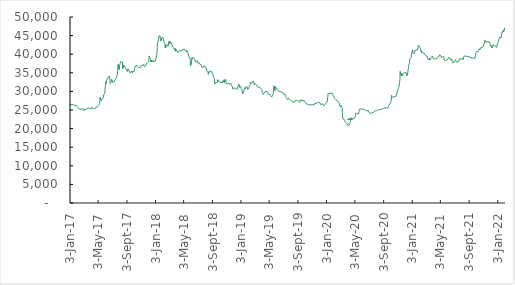
| Category | Series 0 |
|---|---|
| 2017-01-03 | 26616.89 |
| 2017-01-04 | 26495.04 |
| 2017-01-05 | 26212.09 |
| 2017-01-06 | 26251.39 |
| 2017-01-09 | 26580.22 |
| 2017-01-10 | 26346.24 |
| 2017-01-11 | 26385.8 |
| 2017-01-12 | 26330.39 |
| 2017-01-13 | 26325.93 |
| 2017-01-16 | 26373.83 |
| 2017-01-17 | 26278.2 |
| 2017-01-18 | 26245.34 |
| 2017-01-19 | 26201.6 |
| 2017-01-20 | 26223.54 |
| 2017-01-23 | 26231.37 |
| 2017-01-24 | 26217.54 |
| 2017-01-25 | 26240.45 |
| 2017-01-26 | 26289.95 |
| 2017-01-27 | 26328.22 |
| 2017-01-30 | 26217.18 |
| 2017-01-31 | 26036.24 |
| 2017-02-01 | 25900.67 |
| 2017-02-02 | 25936.24 |
| 2017-02-03 | 25802.54 |
| 2017-02-06 | 25587.09 |
| 2017-02-07 | 25446.66 |
| 2017-02-08 | 25460.45 |
| 2017-02-09 | 25322.3 |
| 2017-02-10 | 25340.02 |
| 2017-02-13 | 25244.65 |
| 2017-02-14 | 25032.17 |
| 2017-02-15 | 25130.26 |
| 2017-02-16 | 25055.29 |
| 2017-02-17 | 25164.91 |
| 2017-02-20 | 25249.49 |
| 2017-02-21 | 25251.63 |
| 2017-02-22 | 25249.74 |
| 2017-02-23 | 25409.06 |
| 2017-02-24 | 25250.37 |
| 2017-02-27 | 25373.42 |
| 2017-02-28 | 25329.08 |
| 2017-03-01 | 25183.1 |
| 2017-03-02 | 24829.59 |
| 2017-03-03 | 25012.08 |
| 2017-03-06 | 24581.99 |
| 2017-03-07 | 25129.99 |
| 2017-03-08 | 24994.81 |
| 2017-03-09 | 25170.36 |
| 2017-03-10 | 25238.01 |
| 2017-03-13 | 25136.63 |
| 2017-03-14 | 25284.56 |
| 2017-03-15 | 25301.23 |
| 2017-03-16 | 25418.08 |
| 2017-03-17 | 25653.16 |
| 2017-03-20 | 25671.55 |
| 2017-03-21 | 25558.57 |
| 2017-03-22 | 25514.17 |
| 2017-03-23 | 25514.03 |
| 2017-03-24 | 25454.93 |
| 2017-03-27 | 25485.17 |
| 2017-03-28 | 25406.72 |
| 2017-03-29 | 25267.68 |
| 2017-03-30 | 25533.82 |
| 2017-03-31 | 25516.34 |
| 2017-04-03 | 25273.03 |
| 2017-04-04 | 25266.15 |
| 2017-04-05 | 25471.69 |
| 2017-04-06 | 25755.18 |
| 2017-04-07 | 25746.52 |
| 2017-04-10 | 25626.37 |
| 2017-04-11 | 25478.06 |
| 2017-04-12 | 25496.71 |
| 2017-04-13 | 25510.01 |
| 2017-04-18 | 25218.12 |
| 2017-04-19 | 25331.77 |
| 2017-04-20 | 25288.11 |
| 2017-04-21 | 25189.37 |
| 2017-04-24 | 25747.05 |
| 2017-04-25 | 25818.87 |
| 2017-04-26 | 25620.94 |
| 2017-04-27 | 25753 |
| 2017-04-28 | 25767.26 |
| 2017-05-02 | 25965.18 |
| 2017-05-03 | 26117.32 |
| 2017-05-04 | 26166.8 |
| 2017-05-05 | 26235.63 |
| 2017-05-08 | 26419.17 |
| 2017-05-09 | 26756.21 |
| 2017-05-10 | 27546.68 |
| 2017-05-11 | 28423.7 |
| 2017-05-12 | 28192.46 |
| 2017-05-15 | 27513.69 |
| 2017-05-16 | 27609.67 |
| 2017-05-17 | 27900.44 |
| 2017-05-18 | 28101.63 |
| 2017-05-19 | 28113.44 |
| 2017-05-22 | 28078.3 |
| 2017-05-23 | 28109.95 |
| 2017-05-24 | 28286.43 |
| 2017-05-25 | 28467.61 |
| 2017-05-26 | 29064.52 |
| 2017-05-30 | 29276.59 |
| 2017-05-31 | 29498.31 |
| 2017-06-01 | 30314.14 |
| 2017-06-02 | 31371.63 |
| 2017-06-05 | 32578.38 |
| 2017-06-06 | 32200.38 |
| 2017-06-07 | 32686.72 |
| 2017-06-08 | 32937.98 |
| 2017-06-09 | 33276.68 |
| 2017-06-12 | 33235.28 |
| 2017-06-13 | 33142.18 |
| 2017-06-14 | 33598.2 |
| 2017-06-15 | 33797.84 |
| 2017-06-16 | 33810.56 |
| 2017-06-19 | 34135.1 |
| 2017-06-20 | 34375.6 |
| 2017-06-21 | 33477.89 |
| 2017-06-22 | 32928.44 |
| 2017-06-23 | 32122.14 |
| 2017-06-28 | 32657.3 |
| 2017-06-29 | 33269.84 |
| 2017-06-30 | 33117.48 |
| 2017-07-03 | 32769.8 |
| 2017-07-04 | 32410.2 |
| 2017-07-05 | 32302.32 |
| 2017-07-06 | 32354.78 |
| 2017-07-07 | 32459.17 |
| 2017-07-10 | 32614.6 |
| 2017-07-11 | 32827.98 |
| 2017-07-12 | 32981.63 |
| 2017-07-13 | 33246.91 |
| 2017-07-14 | 33261.66 |
| 2017-07-17 | 33301.43 |
| 2017-07-18 | 33436.61 |
| 2017-07-19 | 33514.93 |
| 2017-07-20 | 33695.83 |
| 2017-07-21 | 34020.37 |
| 2017-07-24 | 34652.52 |
| 2017-07-25 | 35533 |
| 2017-07-26 | 36740.77 |
| 2017-07-27 | 37245.17 |
| 2017-07-28 | 36864.71 |
| 2017-07-31 | 35847.75 |
| 2017-08-01 | 36720.62 |
| 2017-08-02 | 36905.06 |
| 2017-08-03 | 37135.23 |
| 2017-08-04 | 37425.15 |
| 2017-08-07 | 37525.38 |
| 2017-08-08 | 37999.56 |
| 2017-08-09 | 38144.02 |
| 2017-08-10 | 38102.85 |
| 2017-08-11 | 38198.6 |
| 2017-08-14 | 37950.96 |
| 2017-08-15 | 37096.6 |
| 2017-08-16 | 36102.38 |
| 2017-08-17 | 36316.58 |
| 2017-08-18 | 36920.56 |
| 2017-08-21 | 36584.44 |
| 2017-08-22 | 36962.48 |
| 2017-08-23 | 37059.21 |
| 2017-08-24 | 36575.86 |
| 2017-08-25 | 36646.46 |
| 2017-08-28 | 36317.31 |
| 2017-08-29 | 36165.93 |
| 2017-08-30 | 35629.13 |
| 2017-08-31 | 35504.62 |
| 2017-09-05 | 35407.79 |
| 2017-09-06 | 35605.3 |
| 2017-09-07 | 36112.37 |
| 2017-09-08 | 35957.24 |
| 2017-09-11 | 35664.94 |
| 2017-09-12 | 35397.52 |
| 2017-09-13 | 35464.34 |
| 2017-09-14 | 35660.04 |
| 2017-09-15 | 35005.57 |
| 2017-09-18 | 34873.07 |
| 2017-09-19 | 34846.82 |
| 2017-09-20 | 35207.89 |
| 2017-09-21 | 35188.97 |
| 2017-09-22 | 35488.81 |
| 2017-09-25 | 35358.73 |
| 2017-09-26 | 34951.27 |
| 2017-09-27 | 35103.4 |
| 2017-09-28 | 35429.31 |
| 2017-09-29 | 35439.98 |
| 2017-10-03 | 35306.09 |
| 2017-10-04 | 35358.57 |
| 2017-10-05 | 35773.98 |
| 2017-10-06 | 36320.98 |
| 2017-10-09 | 36831.93 |
| 2017-10-10 | 36776.6 |
| 2017-10-11 | 36652.82 |
| 2017-10-12 | 36732.24 |
| 2017-10-13 | 36848.17 |
| 2017-10-16 | 36970.81 |
| 2017-10-17 | 36669.61 |
| 2017-10-18 | 36641.52 |
| 2017-10-19 | 36645.65 |
| 2017-10-20 | 36587.31 |
| 2017-10-23 | 36411.73 |
| 2017-10-24 | 36531.62 |
| 2017-10-25 | 36622.85 |
| 2017-10-26 | 36517.48 |
| 2017-10-27 | 36462.26 |
| 2017-10-30 | 36484.3 |
| 2017-10-31 | 36680.29 |
| 2017-11-01 | 36887.2 |
| 2017-11-02 | 36877.15 |
| 2017-11-03 | 36939.59 |
| 2017-11-06 | 36930.83 |
| 2017-11-07 | 37013.57 |
| 2017-11-08 | 37138.97 |
| 2017-11-09 | 37051.54 |
| 2017-11-10 | 37120.28 |
| 2017-11-13 | 37312.28 |
| 2017-11-14 | 36953.41 |
| 2017-11-15 | 36617.45 |
| 2017-11-16 | 36634.89 |
| 2017-11-17 | 36703.58 |
| 2017-11-20 | 36792.6 |
| 2017-11-21 | 36600.07 |
| 2017-11-22 | 36608.76 |
| 2017-11-23 | 36688.75 |
| 2017-11-24 | 37365.91 |
| 2017-11-27 | 37250.78 |
| 2017-11-28 | 37503.73 |
| 2017-11-29 | 37709.2 |
| 2017-11-30 | 37944.6 |
| 2017-12-04 | 37974.58 |
| 2017-12-05 | 38494.43 |
| 2017-12-06 | 39075.3 |
| 2017-12-07 | 39534.14 |
| 2017-12-08 | 39257.53 |
| 2017-12-11 | 38913.99 |
| 2017-12-12 | 38924.63 |
| 2017-12-13 | 38534.64 |
| 2017-12-14 | 37933.7 |
| 2017-12-15 | 38436.08 |
| 2017-12-18 | 37957.96 |
| 2017-12-19 | 37783.76 |
| 2017-12-20 | 37933.86 |
| 2017-12-21 | 38350.64 |
| 2017-12-22 | 38522.14 |
| 2017-12-27 | 37889.57 |
| 2017-12-28 | 37990.74 |
| 2017-12-29 | 38243.19 |
| 2018-01-02 | 38264.79 |
| 2018-01-03 | 38187.28 |
| 2018-01-04 | 38676.12 |
| 2018-01-05 | 38923.26 |
| 2018-01-08 | 39849.65 |
| 2018-01-09 | 40362.97 |
| 2018-01-10 | 41816.11 |
| 2018-01-11 | 43041.54 |
| 2018-01-12 | 42898.9 |
| 2018-01-15 | 43119 |
| 2018-01-16 | 44054.72 |
| 2018-01-17 | 44885.24 |
| 2018-01-18 | 44848.74 |
| 2018-01-19 | 45092.83 |
| 2018-01-22 | 44912.53 |
| 2018-01-23 | 44389.85 |
| 2018-01-24 | 43963.4 |
| 2018-01-25 | 43529.06 |
| 2018-01-26 | 43773.76 |
| 2018-01-29 | 44306.48 |
| 2018-01-30 | 44493.79 |
| 2018-01-31 | 44343.65 |
| 2018-02-01 | 44460.18 |
| 2018-02-02 | 44639.99 |
| 2018-02-05 | 44261.72 |
| 2018-02-06 | 43877.3 |
| 2018-02-07 | 43538.16 |
| 2018-02-08 | 43326.89 |
| 2018-02-09 | 43127.92 |
| 2018-02-12 | 42737.89 |
| 2018-02-13 | 41708.15 |
| 2018-02-14 | 42171.8 |
| 2018-02-15 | 42604.4 |
| 2018-02-16 | 42638.83 |
| 2018-02-19 | 41988.18 |
| 2018-02-20 | 42148.4 |
| 2018-02-21 | 42158.32 |
| 2018-02-22 | 42258.78 |
| 2018-02-23 | 42570.89 |
| 2018-02-26 | 42579.48 |
| 2018-02-27 | 42299.56 |
| 2018-02-28 | 43330.54 |
| 2018-03-01 | 42843.38 |
| 2018-03-02 | 42876.23 |
| 2018-03-05 | 43513.93 |
| 2018-03-06 | 43609.77 |
| 2018-03-07 | 42952.7 |
| 2018-03-08 | 43092.63 |
| 2018-03-09 | 43167.86 |
| 2018-03-12 | 43056.51 |
| 2018-03-13 | 43073.45 |
| 2018-03-14 | 42839.49 |
| 2018-03-15 | 42185.38 |
| 2018-03-16 | 41935.9 |
| 2018-03-19 | 41845.92 |
| 2018-03-20 | 41686.36 |
| 2018-03-21 | 41495.43 |
| 2018-03-22 | 41633.79 |
| 2018-03-23 | 41472.1 |
| 2018-03-26 | 41454.3 |
| 2018-03-27 | 41243.24 |
| 2018-03-28 | 40802.08 |
| 2018-03-29 | 41504.51 |
| 2018-04-03 | 40855.64 |
| 2018-04-04 | 40749.86 |
| 2018-04-05 | 40875.69 |
| 2018-04-06 | 40841.14 |
| 2018-04-09 | 40429.18 |
| 2018-04-10 | 40499.04 |
| 2018-04-11 | 40846.24 |
| 2018-04-12 | 40813.69 |
| 2018-04-13 | 40928.7 |
| 2018-04-16 | 40987.77 |
| 2018-04-17 | 40788.68 |
| 2018-04-18 | 40772.25 |
| 2018-04-19 | 40874.09 |
| 2018-04-20 | 40814.89 |
| 2018-04-23 | 40763.93 |
| 2018-04-24 | 40802.78 |
| 2018-04-25 | 40755.73 |
| 2018-04-26 | 40777.67 |
| 2018-04-27 | 41244.89 |
| 2018-04-30 | 41268.01 |
| 2018-05-02 | 41306.02 |
| 2018-05-03 | 41107.81 |
| 2018-05-04 | 41218.72 |
| 2018-05-07 | 41233.42 |
| 2018-05-08 | 41155.8 |
| 2018-05-09 | 41080.12 |
| 2018-05-10 | 40915.17 |
| 2018-05-11 | 41022.31 |
| 2018-05-14 | 40677.61 |
| 2018-05-15 | 40628.49 |
| 2018-05-16 | 40992.97 |
| 2018-05-17 | 40676.26 |
| 2018-05-18 | 40472.45 |
| 2018-05-21 | 40425.07 |
| 2018-05-22 | 40249.29 |
| 2018-05-23 | 40150.55 |
| 2018-05-24 | 39723.85 |
| 2018-05-25 | 39323.62 |
| 2018-05-28 | 39040.44 |
| 2018-05-30 | 38606.41 |
| 2018-05-31 | 38104.54 |
| 2018-06-01 | 36816.29 |
| 2018-06-04 | 36947.1 |
| 2018-06-05 | 37854.92 |
| 2018-06-06 | 38435.29 |
| 2018-06-07 | 39042.11 |
| 2018-06-08 | 38669.23 |
| 2018-06-11 | 38845.31 |
| 2018-06-12 | 39167.04 |
| 2018-06-13 | 39031.72 |
| 2018-06-14 | 38928.47 |
| 2018-06-19 | 38664.15 |
| 2018-06-20 | 38605.07 |
| 2018-06-21 | 38152.6 |
| 2018-06-22 | 37862.53 |
| 2018-06-25 | 37992.12 |
| 2018-06-26 | 37988.54 |
| 2018-06-27 | 37963.93 |
| 2018-06-28 | 37733.44 |
| 2018-06-29 | 38278.55 |
| 2018-07-02 | 37946.92 |
| 2018-07-03 | 37606.23 |
| 2018-07-04 | 37499.07 |
| 2018-07-05 | 37743.22 |
| 2018-07-06 | 37625.59 |
| 2018-07-09 | 37647.93 |
| 2018-07-10 | 37422.84 |
| 2018-07-11 | 37253.25 |
| 2018-07-12 | 37226.44 |
| 2018-07-13 | 37392.77 |
| 2018-07-16 | 37266.86 |
| 2018-07-17 | 36963.7 |
| 2018-07-18 | 36748.18 |
| 2018-07-19 | 36506.42 |
| 2018-07-20 | 36603.44 |
| 2018-07-23 | 36711.96 |
| 2018-07-24 | 36455.24 |
| 2018-07-25 | 36346.8 |
| 2018-07-26 | 36427.22 |
| 2018-07-27 | 36636.97 |
| 2018-07-30 | 36946.18 |
| 2018-07-31 | 37017.78 |
| 2018-08-01 | 36612.83 |
| 2018-08-02 | 36688.91 |
| 2018-08-03 | 36499.67 |
| 2018-08-06 | 36479.42 |
| 2018-08-07 | 36333.8 |
| 2018-08-08 | 36299.82 |
| 2018-08-09 | 36232.66 |
| 2018-08-10 | 35446.47 |
| 2018-08-13 | 35399.28 |
| 2018-08-14 | 35288.23 |
| 2018-08-15 | 35074.82 |
| 2018-08-16 | 34617.12 |
| 2018-08-17 | 35266.29 |
| 2018-08-20 | 35341.9 |
| 2018-08-23 | 35206.16 |
| 2018-08-24 | 35426.21 |
| 2018-08-27 | 35311.36 |
| 2018-08-28 | 35516.21 |
| 2018-08-29 | 35358.94 |
| 2018-08-30 | 35086.67 |
| 2018-08-31 | 34848.45 |
| 2018-09-03 | 34837.5 |
| 2018-09-04 | 34933.68 |
| 2018-09-05 | 34414.37 |
| 2018-09-06 | 34110.22 |
| 2018-09-07 | 34037.91 |
| 2018-09-10 | 33611.69 |
| 2018-09-11 | 33449.17 |
| 2018-09-12 | 32292.79 |
| 2018-09-13 | 32022.23 |
| 2018-09-14 | 32327.59 |
| 2018-09-17 | 32201.98 |
| 2018-09-18 | 32381 |
| 2018-09-19 | 32375.12 |
| 2018-09-20 | 32480.89 |
| 2018-09-21 | 32540.17 |
| 2018-09-24 | 32451.27 |
| 2018-09-25 | 33144.44 |
| 2018-09-26 | 32963.27 |
| 2018-09-27 | 32763.35 |
| 2018-09-28 | 32766.37 |
| 2018-10-02 | 32711.65 |
| 2018-10-03 | 32453.03 |
| 2018-10-04 | 32423.57 |
| 2018-10-05 | 32383.15 |
| 2018-10-08 | 32444.96 |
| 2018-10-09 | 32417.7 |
| 2018-10-10 | 32382.58 |
| 2018-10-11 | 32417.82 |
| 2018-10-12 | 32456.98 |
| 2018-10-15 | 32413.48 |
| 2018-10-16 | 32722.18 |
| 2018-10-17 | 32437.35 |
| 2018-10-18 | 32664.63 |
| 2018-10-19 | 32841.69 |
| 2018-10-22 | 32962.82 |
| 2018-10-23 | 33191.45 |
| 2018-10-24 | 32403.6 |
| 2018-10-25 | 32545.06 |
| 2018-10-26 | 32907.33 |
| 2018-10-29 | 33196.07 |
| 2018-10-30 | 33167.88 |
| 2018-10-31 | 32466.27 |
| 2018-11-01 | 32006.65 |
| 2018-11-02 | 32124.94 |
| 2018-11-05 | 32048.18 |
| 2018-11-06 | 32154.03 |
| 2018-11-07 | 32108.3 |
| 2018-11-08 | 32228.5 |
| 2018-11-09 | 32200.21 |
| 2018-11-12 | 32143.41 |
| 2018-11-13 | 32152.9 |
| 2018-11-14 | 32108.92 |
| 2018-11-15 | 31864.8 |
| 2018-11-16 | 32058.28 |
| 2018-11-19 | 32222.24 |
| 2018-11-21 | 31969.79 |
| 2018-11-22 | 31984.6 |
| 2018-11-23 | 31678.7 |
| 2018-11-26 | 31533.51 |
| 2018-11-27 | 31173.71 |
| 2018-11-28 | 31023.47 |
| 2018-11-29 | 30611.55 |
| 2018-11-30 | 30874.17 |
| 2018-12-03 | 30798.76 |
| 2018-12-04 | 31007.25 |
| 2018-12-05 | 31151.68 |
| 2018-12-06 | 30819.1 |
| 2018-12-07 | 30866.82 |
| 2018-12-10 | 30614.73 |
| 2018-12-11 | 30718.72 |
| 2018-12-12 | 30642.35 |
| 2018-12-13 | 30568.05 |
| 2018-12-14 | 30672.79 |
| 2018-12-17 | 30609.02 |
| 2018-12-18 | 30822.33 |
| 2018-12-19 | 30704.98 |
| 2018-12-20 | 30802.9 |
| 2018-12-21 | 30773.64 |
| 2018-12-24 | 31967.01 |
| 2018-12-27 | 31692.63 |
| 2018-12-28 | 31037.72 |
| 2018-12-31 | 31430.5 |
| 2019-01-02 | 31070.06 |
| 2019-01-03 | 30771.32 |
| 2019-01-04 | 30638.9 |
| 2019-01-07 | 30400.28 |
| 2019-01-08 | 30036.15 |
| 2019-01-09 | 29336.8 |
| 2019-01-10 | 29517.73 |
| 2019-01-11 | 29830.7 |
| 2019-01-14 | 29964.79 |
| 2019-01-15 | 30137.53 |
| 2019-01-16 | 30460.68 |
| 2019-01-17 | 30583.21 |
| 2019-01-18 | 31005.17 |
| 2019-01-21 | 30732.72 |
| 2019-01-22 | 30736.88 |
| 2019-01-23 | 30878.56 |
| 2019-01-24 | 30989.6 |
| 2019-01-25 | 31426.63 |
| 2019-01-28 | 31344.24 |
| 2019-01-29 | 31178.71 |
| 2019-01-30 | 31145.34 |
| 2019-01-31 | 30557.2 |
| 2019-02-01 | 30636.36 |
| 2019-02-04 | 30745.05 |
| 2019-02-05 | 30773.57 |
| 2019-02-06 | 30821.8 |
| 2019-02-07 | 31433.49 |
| 2019-02-08 | 31529.92 |
| 2019-02-11 | 31781.87 |
| 2019-02-12 | 32462.31 |
| 2019-02-13 | 32413.92 |
| 2019-02-14 | 32453.69 |
| 2019-02-15 | 32715.2 |
| 2019-02-18 | 32190.07 |
| 2019-02-19 | 32406.18 |
| 2019-02-20 | 32614.06 |
| 2019-02-21 | 32568.66 |
| 2019-02-22 | 32515.52 |
| 2019-02-25 | 32700.12 |
| 2019-02-26 | 32473.82 |
| 2019-02-27 | 32244.24 |
| 2019-02-28 | 31721.76 |
| 2019-03-01 | 31827.24 |
| 2019-03-04 | 32129.94 |
| 2019-03-05 | 32173.66 |
| 2019-03-06 | 32121.74 |
| 2019-03-07 | 32010.06 |
| 2019-03-08 | 31924.51 |
| 2019-03-11 | 31636.66 |
| 2019-03-12 | 31313.36 |
| 2019-03-13 | 31360.28 |
| 2019-03-14 | 31210.79 |
| 2019-03-15 | 31142.72 |
| 2019-03-18 | 31125.39 |
| 2019-03-19 | 31082.32 |
| 2019-03-20 | 31040.84 |
| 2019-03-21 | 30885.31 |
| 2019-03-22 | 31139.35 |
| 2019-03-25 | 31042.33 |
| 2019-03-26 | 31038.86 |
| 2019-03-27 | 30829.45 |
| 2019-03-28 | 30833.5 |
| 2019-03-29 | 31041.42 |
| 2019-04-01 | 30527.5 |
| 2019-04-02 | 30226.77 |
| 2019-04-03 | 29668.73 |
| 2019-04-04 | 29553.12 |
| 2019-04-05 | 29616.38 |
| 2019-04-08 | 29162.24 |
| 2019-04-09 | 29158.736 |
| 2019-04-10 | 29193.42 |
| 2019-04-11 | 29347.62 |
| 2019-04-12 | 29560.47 |
| 2019-04-15 | 29495.91 |
| 2019-04-16 | 29746.24 |
| 2019-04-17 | 29970.86 |
| 2019-04-18 | 30086.31 |
| 2019-04-23 | 30076 |
| 2019-04-24 | 29898.31 |
| 2019-04-25 | 29919.44 |
| 2019-04-26 | 29740.41 |
| 2019-04-29 | 29521.06 |
| 2019-04-30 | 29159.74 |
| 2019-05-02 | 29171.73 |
| 2019-05-03 | 29212 |
| 2019-05-06 | 29196.87 |
| 2019-05-07 | 29096.41 |
| 2019-05-08 | 28966.41 |
| 2019-05-09 | 28896.25 |
| 2019-05-10 | 28847.81 |
| 2019-05-13 | 28484.44 |
| 2019-05-14 | 28422.76 |
| 2019-05-15 | 28286.08 |
| 2019-05-16 | 28438.19 |
| 2019-05-17 | 28871.93 |
| 2019-05-20 | 29374.47 |
| 2019-05-21 | 30218.14 |
| 2019-05-22 | 31145.15 |
| 2019-05-23 | 31477.51 |
| 2019-05-24 | 30881.29 |
| 2019-05-27 | 30194.71 |
| 2019-05-28 | 31307 |
| 2019-05-30 | 31254.19 |
| 2019-05-31 | 31069.37 |
| 2019-06-03 | 30930.39 |
| 2019-06-06 | 30527.07 |
| 2019-06-07 | 30432.13 |
| 2019-06-10 | 30322.19 |
| 2019-06-11 | 30099.83 |
| 2019-06-13 | 30029.15 |
| 2019-06-14 | 30046.7 |
| 2019-06-17 | 29936.33 |
| 2019-06-18 | 29818.8 |
| 2019-06-19 | 29772.72 |
| 2019-06-20 | 29765.31 |
| 2019-06-21 | 29851.29 |
| 2019-06-24 | 29809 |
| 2019-06-25 | 29668.68 |
| 2019-06-26 | 29609 |
| 2019-06-27 | 29749.35 |
| 2019-06-28 | 29966.87 |
| 2019-07-01 | 29614.61 |
| 2019-07-02 | 29395.14 |
| 2019-07-03 | 29375.25 |
| 2019-07-04 | 29300.09 |
| 2019-07-05 | 29270.95 |
| 2019-07-08 | 29287.87 |
| 2019-07-09 | 29318.85 |
| 2019-07-10 | 29256.6 |
| 2019-07-11 | 28712.9 |
| 2019-07-12 | 28566.79 |
| 2019-07-15 | 28341.03 |
| 2019-07-16 | 28200.88 |
| 2019-07-17 | 28042.8 |
| 2019-07-18 | 27864.49 |
| 2019-07-19 | 27919.5 |
| 2019-07-22 | 27808.69 |
| 2019-07-23 | 28144.87 |
| 2019-07-24 | 28088.74 |
| 2019-07-25 | 27990.61 |
| 2019-07-26 | 27918.59 |
| 2019-07-29 | 27950.36 |
| 2019-07-30 | 27820.57 |
| 2019-07-31 | 27718.26 |
| 2019-08-01 | 27748.46 |
| 2019-08-02 | 27630.46 |
| 2019-08-05 | 27672.29 |
| 2019-08-06 | 27527.4 |
| 2019-08-07 | 27412.13 |
| 2019-08-08 | 27424.92 |
| 2019-08-09 | 27306.81 |
| 2019-08-14 | 27083.11 |
| 2019-08-15 | 27052.93 |
| 2019-08-16 | 26925.29 |
| 2019-08-19 | 27115.89 |
| 2019-08-20 | 27058.62 |
| 2019-08-21 | 27352.94 |
| 2019-08-22 | 27629.66 |
| 2019-08-23 | 27800.17 |
| 2019-08-26 | 27691.85 |
| 2019-08-27 | 27602.77 |
| 2019-08-28 | 27607.02 |
| 2019-08-29 | 27425.57 |
| 2019-08-30 | 27525.81 |
| 2019-09-02 | 27565.09 |
| 2019-09-03 | 27586.79 |
| 2019-09-04 | 27319.64 |
| 2019-09-05 | 27273.14 |
| 2019-09-06 | 27146.57 |
| 2019-09-09 | 27089.84 |
| 2019-09-10 | 27047.58 |
| 2019-09-11 | 27153.53 |
| 2019-09-12 | 27426.64 |
| 2019-09-13 | 27779 |
| 2019-09-16 | 27574.32 |
| 2019-09-17 | 27407.04 |
| 2019-09-18 | 27681.61 |
| 2019-09-19 | 27646.15 |
| 2019-09-20 | 27698.69 |
| 2019-09-23 | 27657.27 |
| 2019-09-24 | 27352.24 |
| 2019-09-25 | 27283.05 |
| 2019-09-26 | 27579.85 |
| 2019-09-27 | 27675.04 |
| 2019-09-30 | 27630.56 |
| 2019-10-02 | 27314.87 |
| 2019-10-03 | 27085.69 |
| 2019-10-04 | 26987.45 |
| 2019-10-07 | 26866.41 |
| 2019-10-08 | 26809.92 |
| 2019-10-09 | 26598.94 |
| 2019-10-10 | 26583.75 |
| 2019-10-11 | 26533.78 |
| 2019-10-14 | 26557.44 |
| 2019-10-15 | 26513.65 |
| 2019-10-16 | 26472.2 |
| 2019-10-17 | 26456.29 |
| 2019-10-18 | 26448.62 |
| 2019-10-21 | 26390.08 |
| 2019-10-22 | 26365.83 |
| 2019-10-23 | 26397.94 |
| 2019-10-24 | 26357.24 |
| 2019-10-25 | 26348.73 |
| 2019-10-28 | 26384.45 |
| 2019-10-29 | 26244.39 |
| 2019-10-30 | 26310.77 |
| 2019-10-31 | 26355.35 |
| 2019-11-01 | 26293.3 |
| 2019-11-04 | 26401.06 |
| 2019-11-05 | 26375.35 |
| 2019-11-06 | 26223.66 |
| 2019-11-07 | 26188.24 |
| 2019-11-08 | 26314.49 |
| 2019-11-12 | 26456.39 |
| 2019-11-13 | 26339.11 |
| 2019-11-14 | 26843.11 |
| 2019-11-15 | 26851.68 |
| 2019-11-18 | 26691.09 |
| 2019-11-19 | 26739.52 |
| 2019-11-20 | 26776.15 |
| 2019-11-21 | 26872.09 |
| 2019-11-22 | 26991.42 |
| 2019-11-25 | 27035.78 |
| 2019-11-26 | 26883.33 |
| 2019-11-27 | 26790.1 |
| 2019-11-28 | 26824.5 |
| 2019-11-29 | 27002.15 |
| 2019-12-02 | 26990.59 |
| 2019-12-03 | 26944.32 |
| 2019-12-04 | 26938.58 |
| 2019-12-05 | 26913.7 |
| 2019-12-06 | 26855.52 |
| 2019-12-09 | 26681.31 |
| 2019-12-10 | 26384.21 |
| 2019-12-11 | 26434 |
| 2019-12-12 | 26569.8 |
| 2019-12-13 | 26536.21 |
| 2019-12-16 | 26695.18 |
| 2019-12-17 | 26660.44 |
| 2019-12-18 | 26665.73 |
| 2019-12-19 | 26584.45 |
| 2019-12-20 | 26526.35 |
| 2019-12-23 | 26115.8 |
| 2019-12-24 | 26090.88 |
| 2019-12-27 | 26416.48 |
| 2019-12-30 | 26609.34 |
| 2019-12-31 | 26842.07 |
| 2020-01-02 | 26867.79 |
| 2020-01-03 | 26968.79 |
| 2020-01-06 | 27339.68 |
| 2020-01-07 | 27586.93 |
| 2020-01-08 | 28562.48 |
| 2020-01-09 | 29395.57 |
| 2020-01-10 | 29415.39 |
| 2020-01-13 | 29633.58 |
| 2020-01-14 | 29283.15 |
| 2020-01-15 | 29062.5 |
| 2020-01-16 | 29352.13 |
| 2020-01-17 | 29618.52 |
| 2020-01-20 | 29710.56 |
| 2020-01-21 | 29462.76 |
| 2020-01-22 | 29458.21 |
| 2020-01-23 | 29591.29 |
| 2020-01-24 | 29628.84 |
| 2020-01-27 | 29552.99 |
| 2020-01-28 | 29378 |
| 2020-01-29 | 29110.9 |
| 2020-01-30 | 29030.93 |
| 2020-01-31 | 28843.53 |
| 2020-02-03 | 28533.4 |
| 2020-02-04 | 28432.27 |
| 2020-02-05 | 28093.76 |
| 2020-02-06 | 28140.41 |
| 2020-02-07 | 28067.09 |
| 2020-02-10 | 27772.19 |
| 2020-02-11 | 27871.9 |
| 2020-02-12 | 27878.43 |
| 2020-02-13 | 27864.84 |
| 2020-02-14 | 27755.87 |
| 2020-02-17 | 27570.58 |
| 2020-02-18 | 27547.56 |
| 2020-02-19 | 27523.08 |
| 2020-02-20 | 27568.91 |
| 2020-02-21 | 27388.62 |
| 2020-02-24 | 27041.03 |
| 2020-02-25 | 27033.1 |
| 2020-02-26 | 26974.38 |
| 2020-02-27 | 26808.24 |
| 2020-02-28 | 26216.46 |
| 2020-03-02 | 25816.57 |
| 2020-03-03 | 26255.11 |
| 2020-03-04 | 26415.54 |
| 2020-03-05 | 26449.22 |
| 2020-03-06 | 26279.61 |
| 2020-03-09 | 25650.47 |
| 2020-03-10 | 24388.66 |
| 2020-03-11 | 23572.75 |
| 2020-03-12 | 22695.88 |
| 2020-03-13 | 22734.07 |
| 2020-03-16 | 22705.19 |
| 2020-03-17 | 22543.07 |
| 2020-03-18 | 22789.64 |
| 2020-03-19 | 22118.9 |
| 2020-03-20 | 22198.43 |
| 2020-03-23 | 21700.98 |
| 2020-03-24 | 21741.16 |
| 2020-03-25 | 21729.48 |
| 2020-03-26 | 21757.47 |
| 2020-03-27 | 21861.78 |
| 2020-03-30 | 21330.79 |
| 2020-03-31 | 21300.47 |
| 2020-04-01 | 21100.54 |
| 2020-04-02 | 21121.2 |
| 2020-04-03 | 21098.57 |
| 2020-04-06 | 20669.38 |
| 2020-04-07 | 20925.19 |
| 2020-04-08 | 21073.26 |
| 2020-04-09 | 21384.03 |
| 2020-04-14 | 21879.95 |
| 2020-04-15 | 22539.94 |
| 2020-04-16 | 22554.84 |
| 2020-04-17 | 22921.59 |
| 2020-04-20 | 22920.41 |
| 2020-04-21 | 22629.92 |
| 2020-04-22 | 22780.3 |
| 2020-04-02 | 22470.79 |
| 2020-04-24 | 22599.38 |
| 2020-04-27 | 22616.28 |
| 2020-04-28 | 22727.87 |
| 2020-04-29 | 22868.4 |
| 2020-04-30 | 23021.01 |
| 2020-05-04 | 23089.86 |
| 2020-05-05 | 23809.31 |
| 2020-05-06 | 24143.37 |
| 2020-05-07 | 24354.25 |
| 2020-05-08 | 24045 |
| 2020-05-11 | 23950.83 |
| 2020-05-12 | 23695.9 |
| 2020-05-13 | 23709.44 |
| 2020-05-14 | 23892.92 |
| 2020-05-15 | 23871.33 |
| 2020-05-18 | 23941.75 |
| 2020-05-19 | 24202.87 |
| 2020-05-20 | 24452.23 |
| 2020-05-21 | 24758.39 |
| 2020-05-22 | 25204.75 |
| 2020-05-27 | 25221.29 |
| 2020-05-28 | 25166.01 |
| 2020-05-29 | 25267.82 |
| 2020-06-01 | 25316.15 |
| 2020-06-02 | 25383.43 |
| 2020-06-03 | 25407.96 |
| 2020-06-04 | 25312.05 |
| 2020-06-05 | 25020.72 |
| 2020-06-08 | 25249.9 |
| 2020-06-09 | 25335.15 |
| 2020-06-10 | 25215.04 |
| 2020-06-11 | 25182.67 |
| 2020-06-15 | 24954.25 |
| 2020-06-16 | 24930.88 |
| 2020-06-17 | 24972.82 |
| 2020-06-18 | 24933.41 |
| 2020-06-19 | 24826.75 |
| 2020-06-22 | 24779.26 |
| 2020-06-23 | 24750.06 |
| 2020-06-24 | 24654.99 |
| 2020-06-25 | 24625.17 |
| 2020-06-26 | 24828.96 |
| 2020-06-29 | 24858.89 |
| 2020-06-30 | 24479.16 |
| 2020-07-01 | 24594.99 |
| 2020-07-02 | 24374.4 |
| 2020-07-03 | 24336.12 |
| 2020-07-06 | 24109.65 |
| 2020-07-07 | 24098.08 |
| 2020-07-08 | 24278.07 |
| 2020-07-09 | 24276.56 |
| 2020-07-10 | 24306.36 |
| 2020-07-13 | 24200.6 |
| 2020-07-14 | 24117.4 |
| 2020-07-15 | 24132.3 |
| 2020-07-16 | 24330.06 |
| 2020-07-17 | 24287.66 |
| 2020-07-20 | 24273.42 |
| 2020-07-21 | 24174.45 |
| 2020-07-22 | 24173.53 |
| 2020-07-23 | 24512.27 |
| 2020-07-24 | 24427.73 |
| 2020-07-27 | 24783.61 |
| 2020-07-28 | 24650.16 |
| 2020-07-29 | 24693.73 |
| 2020-08-03 | 24766.12 |
| 2020-08-04 | 24841.94 |
| 2020-08-05 | 24882.04 |
| 2020-08-06 | 24930.34 |
| 2020-08-07 | 25041.89 |
| 2020-08-10 | 25027.61 |
| 2020-08-11 | 24883.7 |
| 2020-08-12 | 25141.48 |
| 2020-08-13 | 25236.97 |
| 2020-08-14 | 25199.84 |
| 2020-08-17 | 25143.68 |
| 2020-08-18 | 25136.49 |
| 2020-08-19 | 25171.32 |
| 2020-08-20 | 25204.6 |
| 2020-08-21 | 25221.87 |
| 2020-08-24 | 25229.12 |
| 2020-08-25 | 25291.78 |
| 2020-08-26 | 25330.1 |
| 2020-08-27 | 25304.25 |
| 2020-08-28 | 25309.37 |
| 2020-08-31 | 25327.13 |
| 2020-09-01 | 25413.76 |
| 2020-09-02 | 25460 |
| 2020-09-03 | 25511.02 |
| 2020-09-04 | 25605.64 |
| 2020-09-07 | 25582.23 |
| 2020-09-11 | 25520.97 |
| 2020-09-14 | 25605.59 |
| 2020-09-15 | 25597.96 |
| 2020-09-16 | 25558.81 |
| 2020-09-17 | 25533.35 |
| 2020-09-18 | 25572.57 |
| 2020-09-21 | 25574.35 |
| 2020-09-22 | 25654.9 |
| 2020-09-23 | 25783.02 |
| 2020-09-24 | 25987.14 |
| 2020-09-25 | 26319.47 |
| 2020-09-28 | 26507.43 |
| 2020-09-29 | 26611.96 |
| 2020-09-30 | 26837.42 |
| 2020-10-02 | 26982.5 |
| 2020-10-05 | 27554.56 |
| 2020-10-06 | 28909.37 |
| 2020-10-07 | 28634.35 |
| 2020-10-08 | 28546.22 |
| 2020-10-09 | 28415.31 |
| 2020-10-12 | 28337.49 |
| 2020-10-13 | 28344.04 |
| 2020-10-14 | 28344.33 |
| 2020-10-15 | 28344.04 |
| 2020-10-16 | 28659.45 |
| 2020-10-19 | 28659.07 |
| 2020-10-20 | 28665.82 |
| 2020-10-21 | 28449.49 |
| 2020-10-22 | 28563.87 |
| 2020-10-23 | 28697.06 |
| 2020-10-26 | 28777.96 |
| 2020-10-27 | 28980.29 |
| 2020-11-02 | 30479.39 |
| 2020-11-03 | 30733.47 |
| 2020-11-04 | 30741.88 |
| 2020-11-05 | 30738.92 |
| 2020-11-06 | 31016.17 |
| 2020-11-09 | 32243.05 |
| 2020-11-10 | 32647.1 |
| 2020-11-11 | 33268.36 |
| 2020-11-12 | 35342.46 |
| 2020-11-13 | 35037.46 |
| 2020-11-16 | 34795.82 |
| 2020-11-17 | 34242.83 |
| 2020-11-18 | 34818.01 |
| 2020-11-19 | 34643.65 |
| 2020-11-20 | 34136.82 |
| 2020-11-23 | 34119.74 |
| 2020-11-24 | 34340.56 |
| 2020-11-25 | 34769 |
| 2020-11-26 | 34803 |
| 2020-11-27 | 34885.51 |
| 2020-11-30 | 35042.14 |
| 2020-12-01 | 35147.62 |
| 2020-12-02 | 35056.82 |
| 2020-12-03 | 34968.94 |
| 2020-12-04 | 35137.99 |
| 2020-12-07 | 35064.36 |
| 2020-12-08 | 35033.74 |
| 2020-12-09 | 35021.26 |
| 2020-12-10 | 34577.26 |
| 2020-12-11 | 34250.74 |
| 2020-12-14 | 34843.44 |
| 2020-12-15 | 35225.22 |
| 2020-12-16 | 35493.15 |
| 2020-12-17 | 36239.62 |
| 2020-12-18 | 36804.75 |
| 2020-12-21 | 37443.4 |
| 2020-12-22 | 37893.61 |
| 2020-12-23 | 38803.74 |
| 2020-12-24 | 38800.01 |
| 2020-12-29 | 39110.17 |
| 2020-12-30 | 39512.31 |
| 2020-12-31 | 40270.72 |
| 2021-01-04 | 41147.39 |
| 2021-01-05 | 40396.14 |
| 2021-01-06 | 40465.15 |
| 2021-01-07 | 40590.85 |
| 2021-01-08 | 40120.22 |
| 2021-01-11 | 40150.78 |
| 2021-01-12 | 40295.95 |
| 2021-01-13 | 40341.05 |
| 2021-01-14 | 40963.14 |
| 2021-01-15 | 41176.14 |
| 2021-01-18 | 41082.38 |
| 2021-01-19 | 41051.63 |
| 2021-01-20 | 41147.72 |
| 2021-01-21 | 41099.15 |
| 2021-01-22 | 41001.99 |
| 2021-01-25 | 41088.96 |
| 2021-01-26 | 41584.94 |
| 2021-01-27 | 41930.73 |
| 2021-01-28 | 42169.41 |
| 2021-01-29 | 42412.66 |
| 2021-02-01 | 42357.9 |
| 2021-02-02 | 42043.79 |
| 2021-02-03 | 42000.01 |
| 2021-02-04 | 41785.8 |
| 2021-02-05 | 41709.09 |
| 2021-02-08 | 41564.31 |
| 2021-02-09 | 41510.16 |
| 2021-02-10 | 40696.01 |
| 2021-02-11 | 41014.3 |
| 2021-02-12 | 40439.85 |
| 2021-02-15 | 40573.31 |
| 2021-02-16 | 40494.35 |
| 2021-02-17 | 40465.32 |
| 2021-02-18 | 40212.19 |
| 2021-02-19 | 40186.7 |
| 2021-02-22 | 40154.09 |
| 2021-02-23 | 40164.86 |
| 2021-02-24 | 40221.3 |
| 2021-02-25 | 40095.49 |
| 2021-02-26 | 39799.89 |
| 2021-03-01 | 39931.63 |
| 2021-03-02 | 39697.62 |
| 2021-03-03 | 39522.06 |
| 2021-03-04 | 39364.67 |
| 2021-03-05 | 39331.61 |
| 2021-03-08 | 39396.57 |
| 2021-03-09 | 38686.85 |
| 2021-03-10 | 38931.25 |
| 2021-03-11 | 38707.87 |
| 2021-03-12 | 38648.48 |
| 2021-03-15 | 38561.84 |
| 2021-03-16 | 38720.81 |
| 2021-03-17 | 38706.13 |
| 2021-03-18 | 38914.84 |
| 2021-03-19 | 38382.39 |
| 2021-03-22 | 38722.87 |
| 2021-03-23 | 38704.97 |
| 2021-03-24 | 39085.78 |
| 2021-03-25 | 39293.14 |
| 2021-03-26 | 39216.2 |
| 2021-03-29 | 39493.37 |
| 2021-03-30 | 39267.11 |
| 2021-04-01 | 38916.74 |
| 2021-04-06 | 38766.61 |
| 2021-04-07 | 38774.03 |
| 2021-04-08 | 38799.83 |
| 2021-04-09 | 38866.39 |
| 2021-04-12 | 38712.55 |
| 2021-04-13 | 38601.83 |
| 2021-04-14 | 38636.15 |
| 2021-04-15 | 38571.89 |
| 2021-04-16 | 38808.01 |
| 2021-04-19 | 38848.02 |
| 2021-04-20 | 39015.58 |
| 2021-04-21 | 39128.34 |
| 2021-04-22 | 39131.8 |
| 2021-04-23 | 39301.82 |
| 2021-04-26 | 39318.52 |
| 2021-04-28 | 39303.09 |
| 2021-04-29 | 39461.2 |
| 2021-04-30 | 39840.28 |
| 2021-05-04 | 39801.78 |
| 2021-05-05 | 39456.64 |
| 2021-05-06 | 39114.73 |
| 2021-05-07 | 39198.75 |
| 2021-05-10 | 39312.74 |
| 2021-05-11 | 39382.96 |
| 2021-05-14 | 39494.7 |
| 2021-05-17 | 39306.47 |
| 2021-05-18 | 39022.52 |
| 2021-05-19 | 38445.09 |
| 2021-05-21 | 38324.07 |
| 2021-05-24 | 38287.58 |
| 2021-05-25 | 38256.76 |
| 2021-05-26 | 38233.68 |
| 2021-05-28 | 38256.95 |
| 2021-05-31 | 38437.88 |
| 2021-06-01 | 38414.37 |
| 2021-06-02 | 38482.52 |
| 2021-06-03 | 38551.06 |
| 2021-06-04 | 38726.1 |
| 2021-06-07 | 38688.98 |
| 2021-06-08 | 38881.7 |
| 2021-06-09 | 39170.95 |
| 2021-06-10 | 39210.1 |
| 2021-06-11 | 39157.29 |
| 2021-06-15 | 38507.33 |
| 2021-06-16 | 38564.7 |
| 2021-06-17 | 38615.11 |
| 2021-06-18 | 38648.91 |
| 2021-06-21 | 38678.48 |
| 2021-06-22 | 37847.07 |
| 2021-06-23 | 37804.46 |
| 2021-06-24 | 37954.35 |
| 2021-06-25 | 37658.26 |
| 2021-06-28 | 37658.26 |
| 2021-06-29 | 37640.75 |
| 2021-06-30 | 37907.28 |
| 2021-07-01 | 37898.59 |
| 2021-07-02 | 38212.01 |
| 2021-07-05 | 38222.01 |
| 2021-07-06 | 38418.04 |
| 2021-07-07 | 38501.31 |
| 2021-07-08 | 38470.87 |
| 2021-07-09 | 37994.19 |
| 2021-07-12 | 37857.89 |
| 2021-07-13 | 37857.24 |
| 2021-07-14 | 37872.55 |
| 2021-07-15 | 37866.9 |
| 2021-07-16 | 37947.18 |
| 2021-07-19 | 37952.65 |
| 2021-07-22 | 38585.52 |
| 2021-07-23 | 38667.9 |
| 2021-07-26 | 38849.08 |
| 2021-07-27 | 38813.36 |
| 2021-07-28 | 38791.03 |
| 2021-07-29 | 38484.82 |
| 2021-07-30 | 38547.08 |
| 2021-08-02 | 38604.72 |
| 2021-08-03 | 38917.99 |
| 2021-08-04 | 38927.83 |
| 2021-08-05 | 38801.51 |
| 2021-08-06 | 38811.11 |
| 2021-08-09 | 38567.26 |
| 2021-08-10 | 39176.62 |
| 2021-08-11 | 39448.46 |
| 2021-08-12 | 39490.06 |
| 2021-08-13 | 39533.97 |
| 2021-08-16 | 39508.41 |
| 2021-08-17 | 39550.36 |
| 2021-08-18 | 39545.67 |
| 2021-08-19 | 39670.29 |
| 2021-08-20 | 39483.08 |
| 2021-08-23 | 39434.69 |
| 2021-08-24 | 39460.68 |
| 2021-08-25 | 39450 |
| 2021-08-26 | 39477.18 |
| 2021-08-27 | 39485.65 |
| 2021-08-30 | 39326.67 |
| 2021-08-31 | 39219.61 |
| 2021-09-01 | 39184.22 |
| 2021-09-02 | 39252.19 |
| 2021-09-03 | 39261.01 |
| 2021-09-06 | 39252.98 |
| 2021-09-07 | 39251.29 |
| 2021-09-08 | 39204.52 |
| 2021-09-09 | 39201.33 |
| 2021-09-10 | 38921.78 |
| 2021-09-13 | 38915.62 |
| 2021-09-14 | 38920.5 |
| 2021-09-15 | 38968.34 |
| 2021-09-16 | 38911.31 |
| 2021-09-17 | 38943.87 |
| 2021-09-20 | 38906.42 |
| 2021-09-21 | 38873.85 |
| 2021-09-22 | 38852.69 |
| 2021-09-23 | 38874.13 |
| 2021-09-24 | 38962.28 |
| 2021-09-27 | 38864.33 |
| 2021-09-28 | 38858.99 |
| 2021-09-29 | 39592.29 |
| 2021-09-30 | 40221.17 |
| 2021-10-04 | 40243.05 |
| 2021-10-05 | 40716.66 |
| 2021-10-06 | 40765.2 |
| 2021-10-07 | 40829.15 |
| 2021-10-08 | 40868.36 |
| 2021-10-11 | 40714.22 |
| 2021-10-12 | 40897.19 |
| 2021-10-13 | 41051.19 |
| 2021-10-14 | 41129.98 |
| 2021-10-15 | 41438.15 |
| 2021-10-18 | 41144.67 |
| 2021-10-20 | 41249.71 |
| 2021-10-21 | 41704.11 |
| 2021-10-22 | 41763.26 |
| 2021-10-25 | 41814.74 |
| 2021-10-26 | 41814.94 |
| 2021-10-27 | 41789.59 |
| 2021-10-28 | 41961.14 |
| 2021-10-29 | 42038.6 |
| 2021-11-01 | 41976.79 |
| 2021-11-02 | 42013.39 |
| 2021-11-03 | 41975.45 |
| 2021-11-04 | 41943.83 |
| 2021-11-05 | 42014.5 |
| 2021-11-08 | 43246.87 |
| 2021-11-09 | 43730.55 |
| 2021-11-10 | 43707.3 |
| 2021-11-11 | 43609.06 |
| 2021-11-12 | 43253.01 |
| 2021-11-15 | 43230.34 |
| 2021-11-16 | 43455.82 |
| 2021-11-17 | 43349.9 |
| 2021-11-18 | 43285.97 |
| 2021-11-19 | 43199.27 |
| 2021-11-22 | 43266.27 |
| 2021-11-23 | 43255.14 |
| 2021-11-24 | 43245.02 |
| 2021-11-25 | 43108.77 |
| 2021-11-26 | 43308.29 |
| 2021-11-29 | 43270.94 |
| 2021-11-30 | 43248.05 |
| 2021-12-01 | 42463.16 |
| 2021-12-02 | 42247.98 |
| 2021-12-03 | 42167.91 |
| 2021-12-06 | 42008.6 |
| 2021-12-07 | 42018.92 |
| 2021-12-08 | 42435.16 |
| 2021-12-09 | 41685.22 |
| 2021-12-10 | 41882.97 |
| 2021-12-13 | 42411.12 |
| 2021-12-14 | 42317.52 |
| 2021-12-15 | 42357.36 |
| 2021-12-16 | 42270.23 |
| 2021-12-17 | 42353.31 |
| 2021-12-20 | 42394.71 |
| 2021-12-21 | 42388.57 |
| 2021-12-22 | 42244.22 |
| 2021-12-23 | 42230.48 |
| 2021-12-24 | 42262.85 |
| 2021-12-29 | 41807.1 |
| 2021-12-30 | 41813.27 |
| 2021-12-31 | 42716.44 |
| 2022-01-04 | 43026.23 |
| 2022-01-05 | 43476.75 |
| 2022-01-06 | 43607.94 |
| 2022-01-07 | 43854.42 |
| 2022-01-10 | 43897.13 |
| 2022-01-11 | 43859.3 |
| 2022-01-12 | 44608.82 |
| 2022-01-13 | 44604.74 |
| 2022-01-14 | 44454.67 |
| 2022-01-17 | 44399.66 |
| 2022-01-18 | 44655.89 |
| 2022-01-19 | 45430.14 |
| 2022-01-20 | 45890.52 |
| 2022-01-21 | 45957.35 |
| 2022-01-24 | 45928.27 |
| 2022-01-25 | 45939.51 |
| 2022-01-26 | 46529.99 |
| 2022-01-27 | 46009.23 |
| 2022-01-28 | 46205.05 |
| 2022-01-31 | 46624.67 |
| 2022-02-01 | 47111.21 |
| 2022-02-02 | 46930.66 |